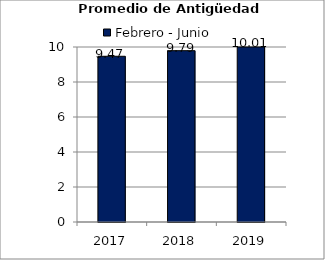
| Category | Febrero - Junio |
|---|---|
| 2017.0 | 9.47 |
| 2018.0 | 9.79 |
| 2019.0 | 10.01 |